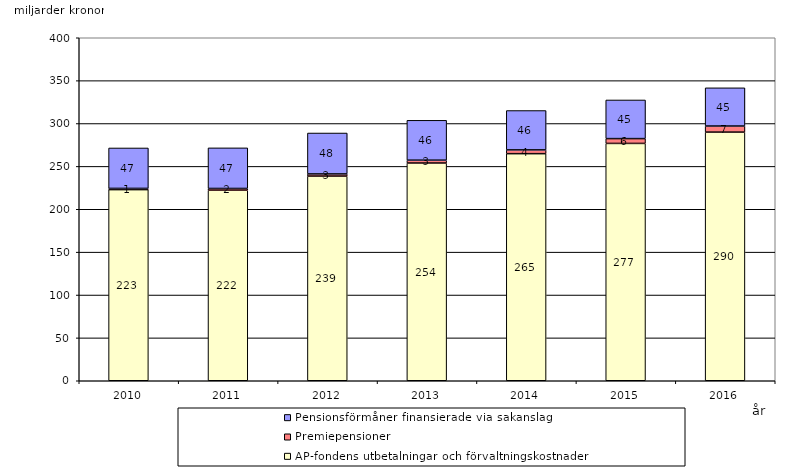
| Category | AP-fondens utbetalningar och förvaltningskostnader | Premiepensioner | Pensionsförmåner finansierade via sakanslag |
|---|---|---|---|
| 2010.0 | 222.897 | 1.412 | 47.171 |
| 2011.0 | 222.213 | 2.028 | 47.341 |
| 2012.0 | 238.672 | 2.516 | 47.727 |
| 2013.0 | 253.925 | 3.32 | 46.49 |
| 2014.0 | 264.828 | 4.409 | 45.898 |
| 2015.0 | 276.778 | 5.616 | 45.053 |
| 2016.0 | 289.96 | 7.093 | 44.555 |